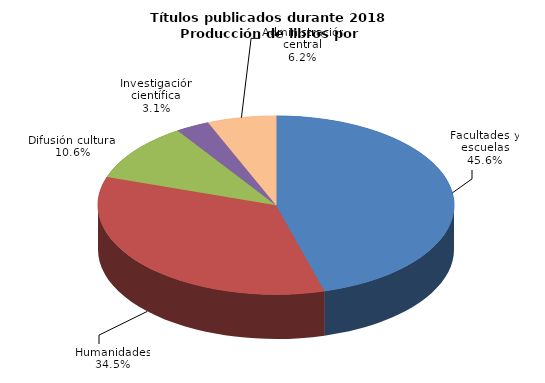
| Category | Series 0 |
|---|---|
| Facultades y escuelas | 755 |
| Humanidades | 571 |
| Difusión cultural | 175 |
| Investigación científica | 51 |
| Administración central | 103 |